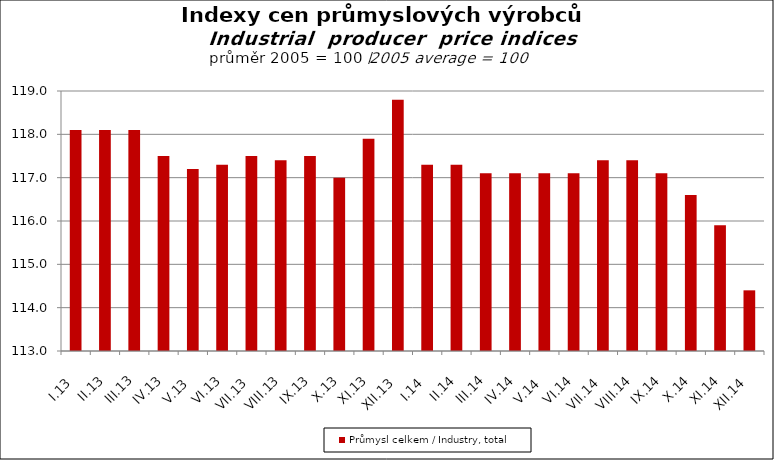
| Category | Průmysl celkem / Industry, total |
|---|---|
| I.13 | 118.1 |
| II.13 | 118.1 |
| III.13 | 118.1 |
| IV.13 | 117.5 |
| V.13 | 117.2 |
| VI.13 | 117.3 |
| VII.13 | 117.5 |
| VIII.13 | 117.4 |
| IX.13 | 117.5 |
| X.13 | 117 |
| XI.13 | 117.9 |
| XII.13 | 118.8 |
| I.14 | 117.3 |
| II.14 | 117.3 |
| III.14 | 117.1 |
| IV.14 | 117.1 |
| V.14 | 117.1 |
| VI.14 | 117.1 |
| VII.14 | 117.4 |
| VIII.14 | 117.4 |
| IX.14 | 117.1 |
| X.14 | 116.6 |
| XI.14 | 115.9 |
| XII.14 | 114.4 |